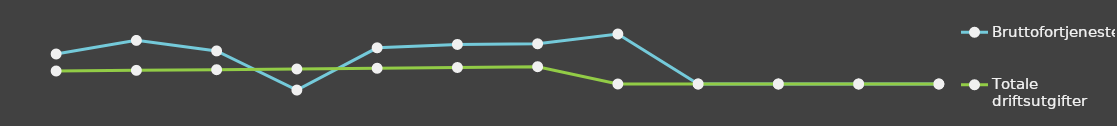
| Category | Bruttofortjeneste | Totale driftsutgifter |
|---|---|---|
| 0 | 25000 | 10841 |
| 1 | 36348 | 11367.25 |
| 2 | 27562 | 11919.82 |
| 3 | -5059.5 | 12500.01 |
| 4 | 30153.18 | 13109.21 |
| 5 | 32964.45 | 13748.86 |
| 6 | 33502.87 | 14420.51 |
| 7 | 41646 | 0 |
| 8 | 0 | 0 |
| 9 | 0 | 0 |
| 10 | 0 | 0 |
| 11 | 0 | 0 |